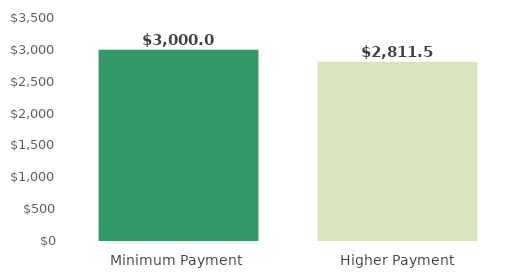
| Category | ChartData |
|---|---|
| 0 | 3000 |
| 1 | 2811.547 |